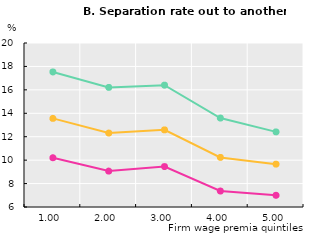
| Category | 25 to 34 | 35 to 49 | 50 to 60 |
|---|---|---|---|
| 1.0 | 17.524 | 13.567 | 10.208 |
| 2.0 | 16.21 | 12.313 | 9.068 |
| 3.0 | 16.401 | 12.584 | 9.449 |
| 4.0 | 13.592 | 10.234 | 7.362 |
| 5.0 | 12.412 | 9.659 | 6.999 |